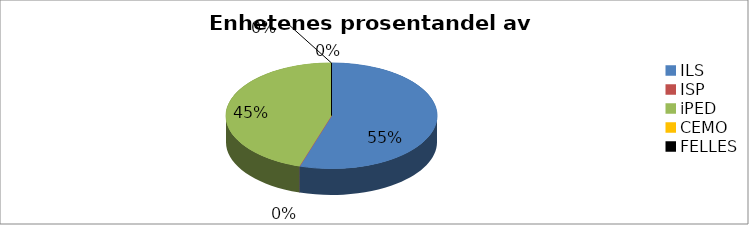
| Category | Series 0 |
|---|---|
| ILS | 1913728.512 |
| ISP | 0 |
| iPED | 1574155.776 |
| CEMO | 0 |
| FELLES | 0 |